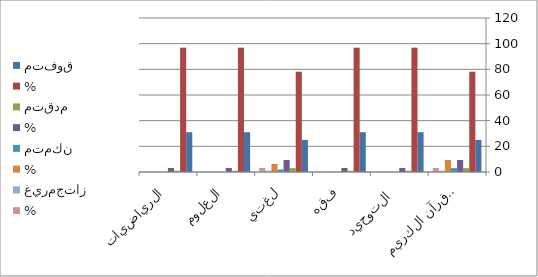
| Category | متفوق | % | متقدم | متمكن | غيرمجتاز |
|---|---|---|---|---|---|
| القرآن الكريم | 25 | 3.125 | 3 | 3 | 1 |
| التوحيد  | 31 | 0 | 1 | 0 | 0 |
| فقه | 31 | 0 | 1 | 0 | 0 |
| لغتي | 25 | 3.125 | 3 | 2 | 1 |
| العلوم | 31 | 0 | 1 | 0 | 0 |
| الرياضيات | 31 | 0 | 1 | 0 | 0 |